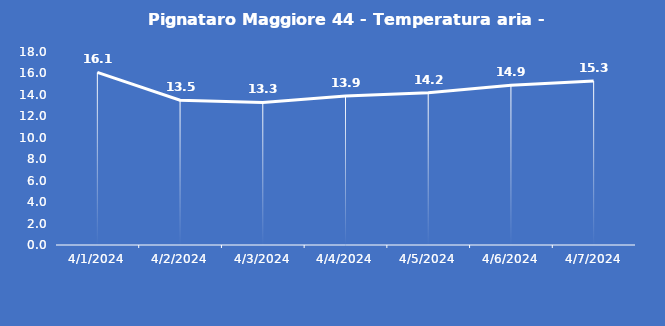
| Category | Pignataro Maggiore 44 - Temperatura aria - Grezzo (°C) |
|---|---|
| 4/1/24 | 16.1 |
| 4/2/24 | 13.5 |
| 4/3/24 | 13.3 |
| 4/4/24 | 13.9 |
| 4/5/24 | 14.2 |
| 4/6/24 | 14.9 |
| 4/7/24 | 15.3 |